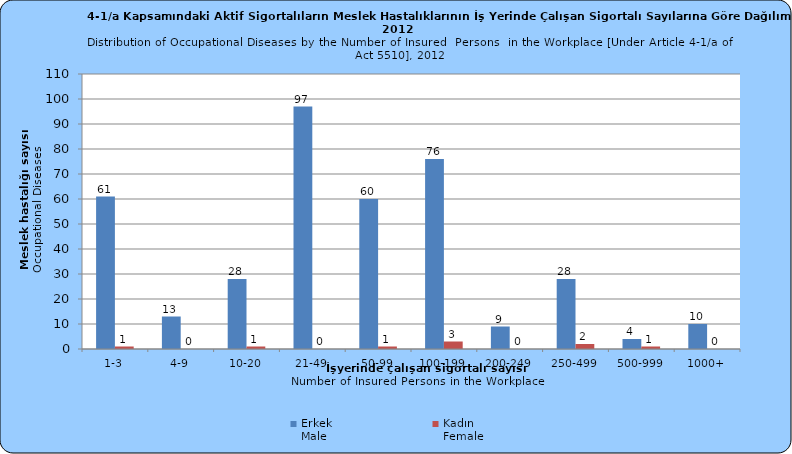
| Category | Erkek
Male | Kadın
Female |
|---|---|---|
| 1-3 | 61 | 1 |
| 4-9 | 13 | 0 |
| 10-20 | 28 | 1 |
| 21-49 | 97 | 0 |
| 50-99 | 60 | 1 |
| 100-199 | 76 | 3 |
| 200-249 | 9 | 0 |
| 250-499 | 28 | 2 |
| 500-999 | 4 | 1 |
| 1000+ | 10 | 0 |